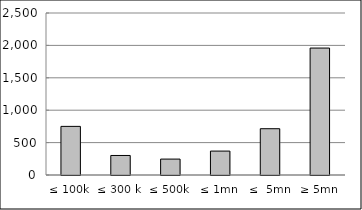
| Category | Series 0 |
|---|---|
| ≤ 100k | 750233387.407 |
| ≤ 300 k | 301231174.873 |
| ≤ 500k | 245662368.97 |
| ≤ 1mn | 369131491.9 |
| ≤  5mn | 714443330.143 |
| ≥ 5mn | 1959151411.998 |